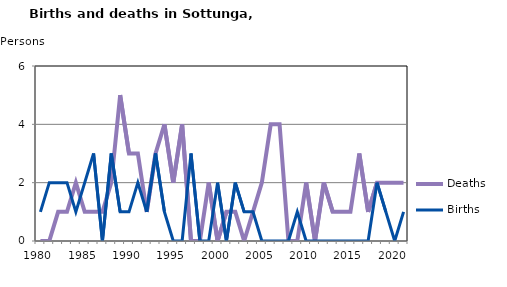
| Category | Deaths | Births |
|---|---|---|
| 1980.0 | 0 | 1 |
| 1981.0 | 0 | 2 |
| 1982.0 | 1 | 2 |
| 1983.0 | 1 | 2 |
| 1984.0 | 2 | 1 |
| 1985.0 | 1 | 2 |
| 1986.0 | 1 | 3 |
| 1987.0 | 1 | 0 |
| 1988.0 | 2 | 3 |
| 1989.0 | 5 | 1 |
| 1990.0 | 3 | 1 |
| 1991.0 | 3 | 2 |
| 1992.0 | 1 | 1 |
| 1993.0 | 3 | 3 |
| 1994.0 | 4 | 1 |
| 1995.0 | 2 | 0 |
| 1996.0 | 4 | 0 |
| 1997.0 | 0 | 3 |
| 1998.0 | 0 | 0 |
| 1999.0 | 2 | 0 |
| 2000.0 | 0 | 2 |
| 2001.0 | 1 | 0 |
| 2002.0 | 1 | 2 |
| 2003.0 | 0 | 1 |
| 2004.0 | 1 | 1 |
| 2005.0 | 2 | 0 |
| 2006.0 | 4 | 0 |
| 2007.0 | 4 | 0 |
| 2008.0 | 0 | 0 |
| 2009.0 | 0 | 1 |
| 2010.0 | 2 | 0 |
| 2011.0 | 0 | 0 |
| 2012.0 | 2 | 0 |
| 2013.0 | 1 | 0 |
| 2014.0 | 1 | 0 |
| 2015.0 | 1 | 0 |
| 2016.0 | 3 | 0 |
| 2017.0 | 1 | 0 |
| 2018.0 | 2 | 2 |
| 2019.0 | 2 | 1 |
| 2020.0 | 2 | 0 |
| 2021.0 | 2 | 1 |